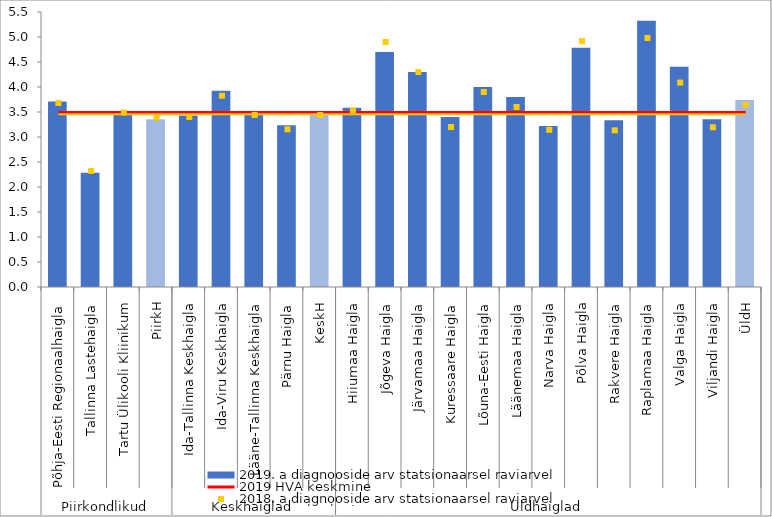
| Category | 2019. a diagnooside arv statsionaarsel raviarvel |
|---|---|
| 0 | 3.711 |
| 1 | 2.283 |
| 2 | 3.455 |
| 3 | 3.357 |
| 4 | 3.43 |
| 5 | 3.927 |
| 6 | 3.512 |
| 7 | 3.233 |
| 8 | 3.497 |
| 9 | 3.583 |
| 10 | 4.7 |
| 11 | 4.3 |
| 12 | 3.4 |
| 13 | 4 |
| 14 | 3.8 |
| 15 | 3.221 |
| 16 | 4.785 |
| 17 | 3.335 |
| 18 | 5.324 |
| 19 | 4.403 |
| 20 | 3.354 |
| 21 | 3.74 |